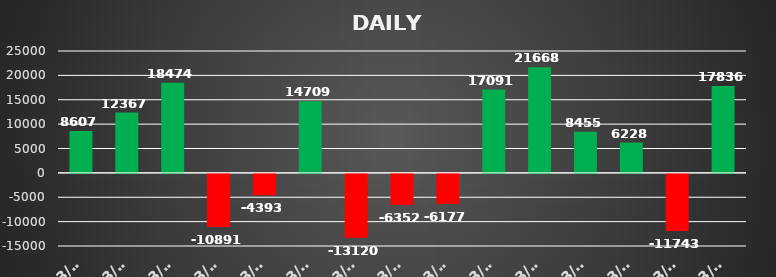
| Category | Series 0 |
|---|---|
| 2021-03-01 | 8607.482 |
| 2021-03-02 | 12367.05 |
| 2021-03-03 | 18473.915 |
| 2021-03-04 | -10890.75 |
| 2021-03-08 | -4392.57 |
| 2021-03-09 | 14709.366 |
| 2021-03-15 | -13119.84 |
| 2021-03-17 | -6352.335 |
| 2021-03-18 | -6177.024 |
| 2021-03-19 | 17090.5 |
| 2021-03-22 | 21667.56 |
| 2021-03-23 | 8454.6 |
| 2021-03-24 | 6228.125 |
| 2021-03-25 | -11743.08 |
| 2021-03-30 | 17836.27 |